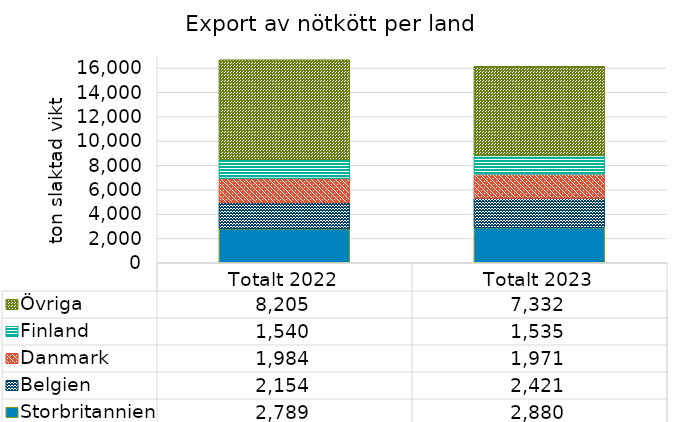
| Category | Storbritannien | Belgien | Danmark | Finland | Övriga |
|---|---|---|---|---|---|
| Totalt 2022 | 2789.214 | 2154.5 | 1983.786 | 1540 | 8205.357 |
| Totalt 2023 | 2879.929 | 2420.714 | 1971.071 | 1535.214 | 7331.643 |